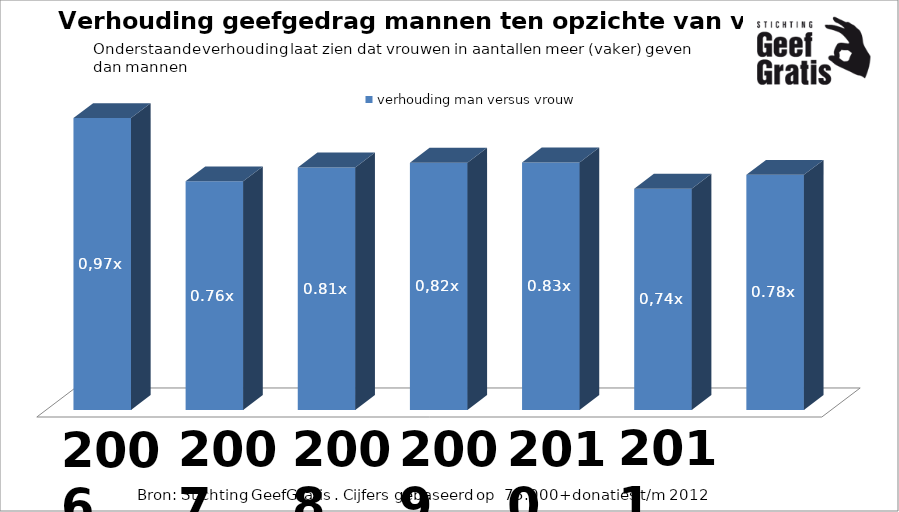
| Category | verhouding man versus vrouw |
|---|---|
| 0 | 0.973 |
| 1 | 0.762 |
| 2 | 0.808 |
| 3 | 0.824 |
| 4 | 0.825 |
| 5 | 0.738 |
| 6 | 0.784 |